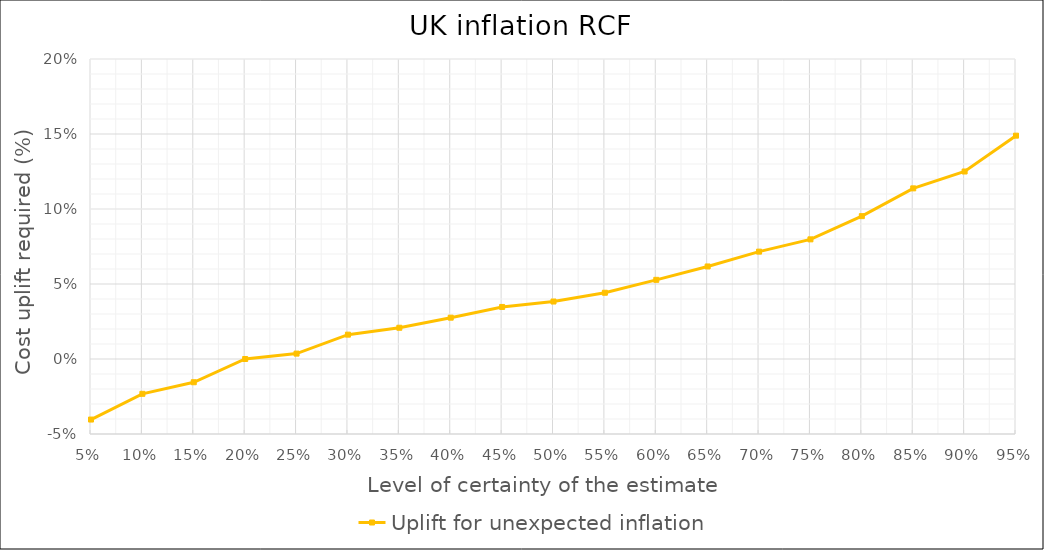
| Category | Uplift for unexpected inflation |
|---|---|
| 0.05 | -0.04 |
| 0.1 | -0.023 |
| 0.15 | -0.015 |
| 0.2 | 0 |
| 0.25 | 0.004 |
| 0.3 | 0.016 |
| 0.35 | 0.021 |
| 0.4 | 0.028 |
| 0.45 | 0.035 |
| 0.5 | 0.038 |
| 0.55 | 0.044 |
| 0.6 | 0.053 |
| 0.65 | 0.062 |
| 0.7 | 0.072 |
| 0.75 | 0.08 |
| 0.8 | 0.095 |
| 0.85 | 0.114 |
| 0.9 | 0.125 |
| 0.95 | 0.149 |